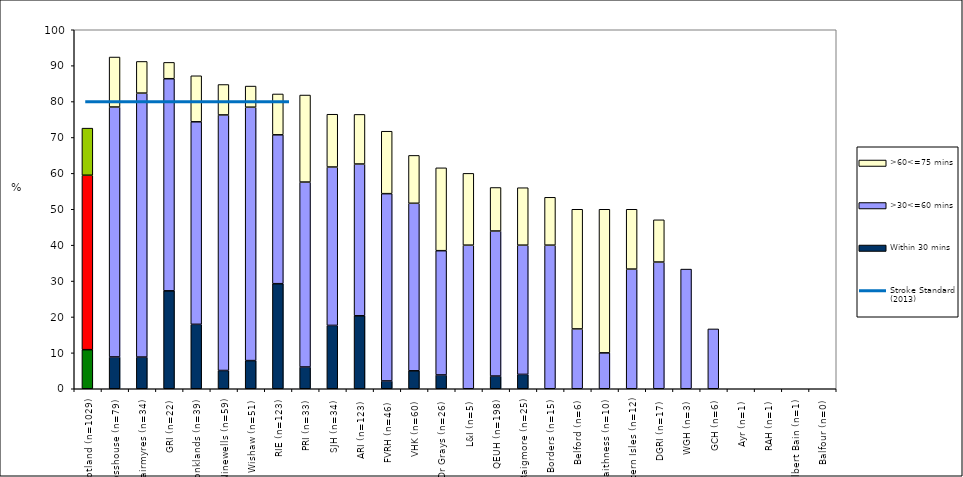
| Category | Within 30 mins | >30<=60 mins | >60<=75 mins |
|---|---|---|---|
| Scotland (n=1029) | 10.884 | 48.591 | 13.12 |
| Crosshouse (n=79) | 8.861 | 69.62 | 13.924 |
| Hairmyres (n=34) | 8.824 | 73.529 | 8.824 |
| GRI (n=22) | 27.273 | 59.091 | 4.545 |
| Monklands (n=39) | 17.949 | 56.41 | 12.821 |
| Ninewells (n=59) | 5.085 | 71.186 | 8.475 |
| Wishaw (n=51) | 7.843 | 70.588 | 5.882 |
| RIE (n=123) | 29.268 | 41.463 | 11.382 |
| PRI (n=33) | 6.061 | 51.515 | 24.242 |
| SJH (n=34) | 17.647 | 44.118 | 14.706 |
| ARI (n=123) | 20.325 | 42.276 | 13.821 |
| FVRH (n=46) | 2.174 | 52.174 | 17.391 |
| VHK (n=60) | 5 | 46.667 | 13.333 |
| Dr Grays (n=26) | 3.846 | 34.615 | 23.077 |
| L&I (n=5) | 0 | 40 | 20 |
| QEUH (n=198) | 3.535 | 40.404 | 12.121 |
| Raigmore (n=25) | 4 | 36 | 16 |
| Borders (n=15) | 0 | 40 | 13.333 |
| Belford (n=6) | 0 | 16.667 | 33.333 |
| Caithness (n=10) | 0 | 10 | 40 |
| Western Isles (n=12) | 0 | 33.333 | 16.667 |
| DGRI (n=17) | 0 | 35.294 | 11.765 |
| WGH (n=3) | 0 | 33.333 | 0 |
| GCH (n=6) | 0 | 16.667 | 0 |
| Ayr (n=1) | 0 | 0 | 0 |
| RAH (n=1) | 0 | 0 | 0 |
| Gilbert Bain (n=1) | 0 | 0 | 0 |
| Balfour (n=0) | 0 | 0 | 0 |